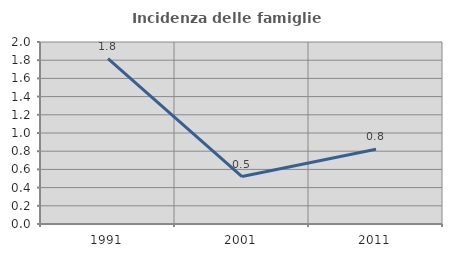
| Category | Incidenza delle famiglie numerose |
|---|---|
| 1991.0 | 1.818 |
| 2001.0 | 0.522 |
| 2011.0 | 0.822 |